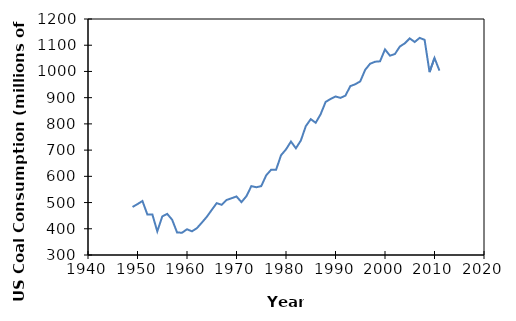
| Category | Series 0 |
|---|---|
| 1949.0 | 483.237 |
| 1950.0 | 494.102 |
| 1951.0 | 505.904 |
| 1952.0 | 454.057 |
| 1953.0 | 454.798 |
| 1954.0 | 389.944 |
| 1955.0 | 447.012 |
| 1956.0 | 456.858 |
| 1957.0 | 434.476 |
| 1958.0 | 385.713 |
| 1959.0 | 385.062 |
| 1960.0 | 398.081 |
| 1961.0 | 390.352 |
| 1962.0 | 402.26 |
| 1963.0 | 423.48 |
| 1964.0 | 445.67 |
| 1965.0 | 471.965 |
| 1966.0 | 497.749 |
| 1967.0 | 491.431 |
| 1968.0 | 509.827 |
| 1969.0 | 516.414 |
| 1970.0 | 523.231 |
| 1971.0 | 501.575 |
| 1972.0 | 524.263 |
| 1973.0 | 562.584 |
| 1974.0 | 558.402 |
| 1975.0 | 562.64 |
| 1976.0 | 603.79 |
| 1977.0 | 625.291 |
| 1978.0 | 625.225 |
| 1979.0 | 680.524 |
| 1980.0 | 702.73 |
| 1981.0 | 732.627 |
| 1982.0 | 706.911 |
| 1983.0 | 736.672 |
| 1984.0 | 791.296 |
| 1985.0 | 818.049 |
| 1986.0 | 804.231 |
| 1987.0 | 836.941 |
| 1988.0 | 883.642 |
| 1989.0 | 895 |
| 1990.0 | 904.498 |
| 1991.0 | 899.227 |
| 1992.0 | 907.655 |
| 1993.0 | 944.081 |
| 1994.0 | 951.286 |
| 1995.0 | 962.104 |
| 1996.0 | 1006.321 |
| 1997.0 | 1029.544 |
| 1998.0 | 1037.103 |
| 1999.0 | 1038.647 |
| 2000.0 | 1084.095 |
| 2001.0 | 1060.146 |
| 2002.0 | 1066.355 |
| 2003.0 | 1094.861 |
| 2004.0 | 1107.255 |
| 2005.0 | 1125.978 |
| 2006.0 | 1112.292 |
| 2007.0 | 1127.998 |
| 2008.0 | 1120.548 |
| 2009.0 | 997.478 |
| 2010.0 | 1051.307 |
| 2011.0 | 1003.066 |